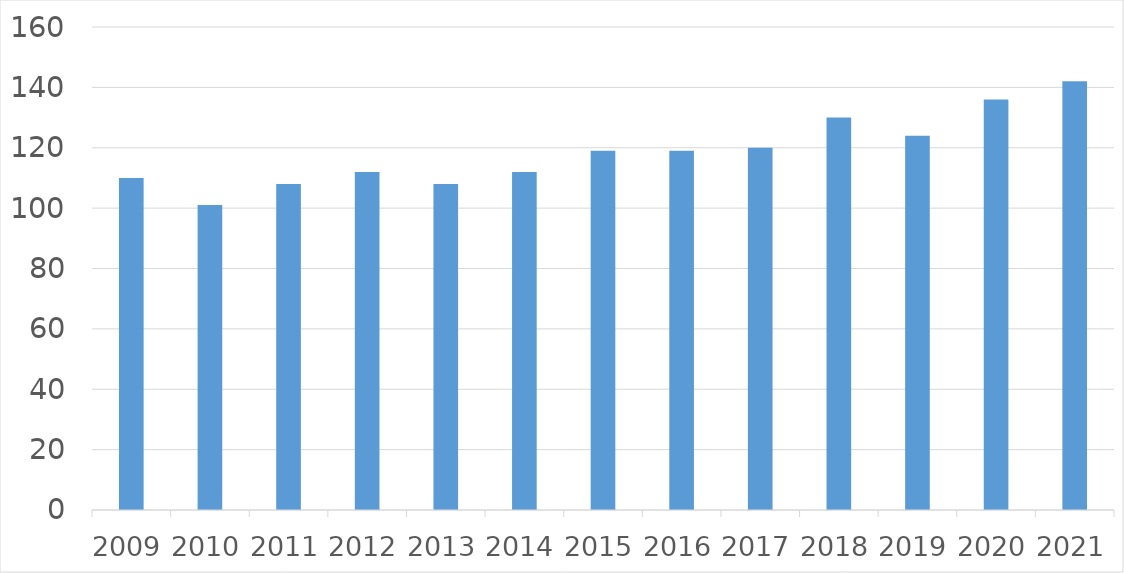
| Category | Series 0 |
|---|---|
| 2009 | 110 |
| 2010 | 101 |
| 2011 | 108 |
| 2012 | 112 |
| 2013 | 108 |
| 2014 | 112 |
| 2015 | 119 |
| 2016 | 119 |
| 2017 | 120 |
| 2018 | 130 |
| 2019 | 124 |
| 2020 | 136 |
| 2021 | 142 |